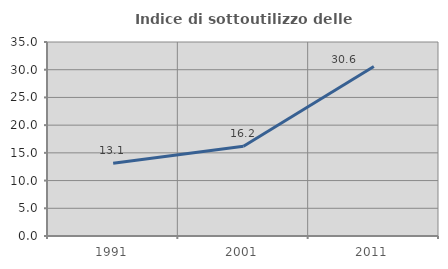
| Category | Indice di sottoutilizzo delle abitazioni  |
|---|---|
| 1991.0 | 13.126 |
| 2001.0 | 16.184 |
| 2011.0 | 30.575 |